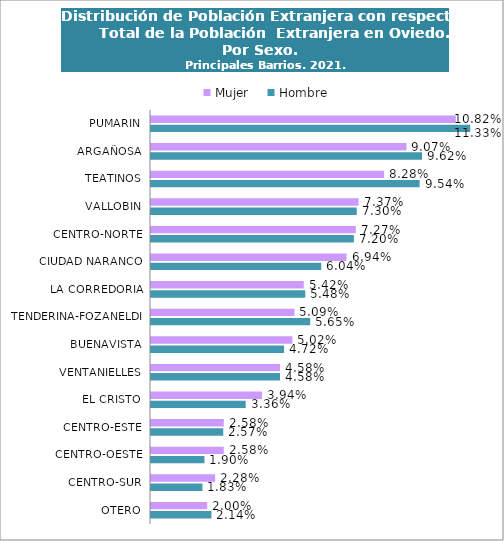
| Category | Hombre | Mujer |
|---|---|---|
| OTERO | 0.021 | 0.02 |
| CENTRO-SUR | 0.018 | 0.023 |
| CENTRO-OESTE | 0.019 | 0.026 |
| CENTRO-ESTE | 0.026 | 0.026 |
| EL CRISTO | 0.034 | 0.039 |
| VENTANIELLES | 0.046 | 0.046 |
| BUENAVISTA | 0.047 | 0.05 |
| TENDERINA-FOZANELDI | 0.057 | 0.051 |
| LA CORREDORIA | 0.055 | 0.054 |
| CIUDAD NARANCO | 0.06 | 0.069 |
| CENTRO-NORTE | 0.072 | 0.073 |
| VALLOBIN | 0.073 | 0.074 |
| TEATINOS | 0.095 | 0.083 |
| ARGAÑOSA | 0.096 | 0.091 |
| PUMARIN | 0.113 | 0.108 |